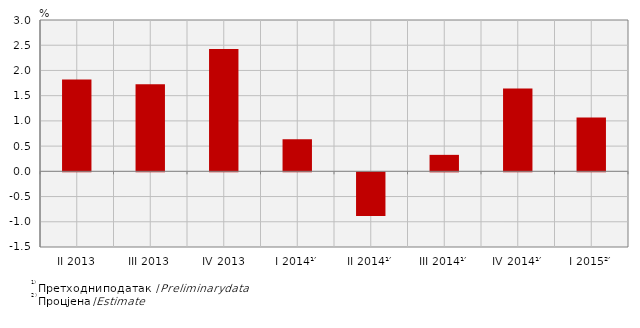
| Category | Стопе реалног раста БДП-а
Real growth rates of GDP |
|---|---|
| II 2013 | 1.821 |
| III 2013 | 1.725 |
| IV 2013 | 2.424 |
| I 2014¹′ | 0.638 |
| II 2014¹′ | -0.864 |
| III 2014¹′ | 0.327 |
| IV 2014¹′ | 1.643 |
| I 2015²′ | 1.069 |